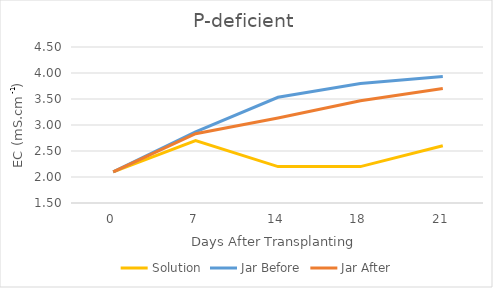
| Category | Solution | Jar Before | Jar After |
|---|---|---|---|
| 0.0 | 2.1 | 2.1 | 2.1 |
| 7.0 | 2.7 | 2.867 | 2.833 |
| 14.0 | 2.2 | 3.533 | 3.133 |
| 18.0 | 2.2 | 3.8 | 3.467 |
| 21.0 | 2.6 | 3.933 | 3.7 |